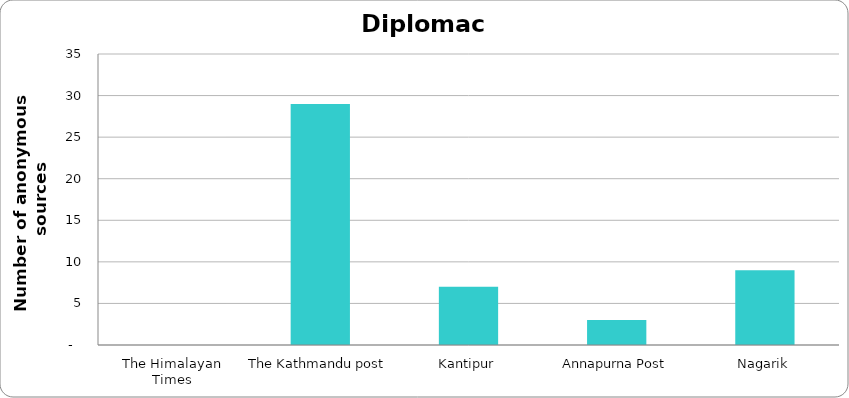
| Category | Diplomacy |
|---|---|
| The Himalayan Times | 0 |
| The Kathmandu post | 29 |
| Kantipur | 7 |
| Annapurna Post | 3 |
| Nagarik | 9 |